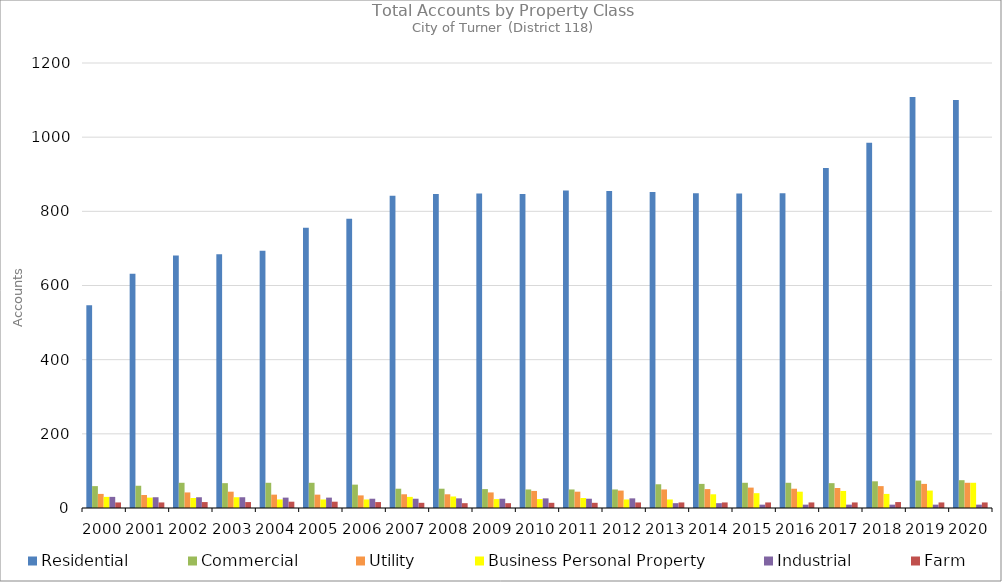
| Category | Residential | Commercial | Utility | Business Personal Property | Industrial | Farm |
|---|---|---|---|---|---|---|
| 2000.0 | 547 | 59 | 38 | 30 | 30 | 15 |
| 2001.0 | 632 | 60 | 35 | 28 | 29 | 15 |
| 2002.0 | 681 | 68 | 42 | 27 | 29 | 16 |
| 2003.0 | 684 | 67 | 44 | 29 | 29 | 16 |
| 2004.0 | 694 | 68 | 36 | 23 | 28 | 17 |
| 2005.0 | 756 | 68 | 36 | 23 | 28 | 17 |
| 2006.0 | 780 | 63 | 34 | 23 | 25 | 16 |
| 2007.0 | 842 | 52 | 37 | 30 | 25 | 14 |
| 2008.0 | 847 | 52 | 37 | 31 | 26 | 13 |
| 2009.0 | 848 | 51 | 42 | 24 | 25 | 13 |
| 2010.0 | 847 | 50 | 46 | 24 | 26 | 14 |
| 2011.0 | 856 | 50 | 44 | 27 | 25 | 14 |
| 2012.0 | 855 | 50 | 47 | 23 | 26 | 15 |
| 2013.0 | 852 | 64 | 50 | 23 | 13 | 15 |
| 2014.0 | 849 | 65 | 51 | 37 | 13 | 15 |
| 2015.0 | 848 | 68 | 55 | 40 | 9 | 15 |
| 2016.0 | 849 | 68 | 52 | 44 | 9 | 15 |
| 2017.0 | 917 | 67 | 54 | 46 | 9 | 15 |
| 2018.0 | 985 | 72 | 59 | 38 | 9 | 16 |
| 2019.0 | 1108 | 74 | 65 | 47 | 9 | 15 |
| 2020.0 | 1100 | 75 | 68 | 68 | 9 | 15 |